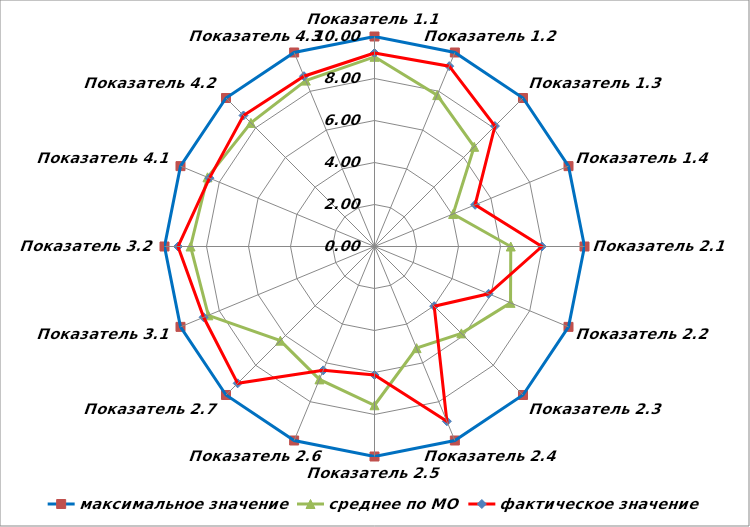
| Category | максимальное значение | среднее по МО | фактическое значение |
|---|---|---|---|
| Показатель 1.1 | 10 | 9.033 | 9.213 |
| Показатель 1.2 | 10 | 7.803 | 9.295 |
| Показатель 1.3 | 10 | 6.713 | 8.112 |
| Показатель 1.4 | 10 | 4.051 | 5.186 |
| Показатель 2.1 | 10 | 6.489 | 7.969 |
| Показатель 2.2 | 10 | 7.011 | 5.881 |
| Показатель 2.3 | 10 | 5.851 | 4.019 |
| Показатель 2.4 | 10 | 5.239 | 9.008 |
| Показатель 2.5 | 10 | 7.56 | 6.118 |
| Показатель 2.6 | 10 | 6.849 | 6.385 |
| Показатель 2.7 | 10 | 6.342 | 9.215 |
| Показатель 3.1 | 10 | 8.563 | 8.807 |
| Показатель 3.2 | 10 | 8.76 | 9.358 |
| Показатель 4.1 | 10 | 8.608 | 8.505 |
| Показатель 4.2 | 10 | 8.323 | 8.823 |
| Показатель 4.3 | 10 | 8.551 | 8.777 |